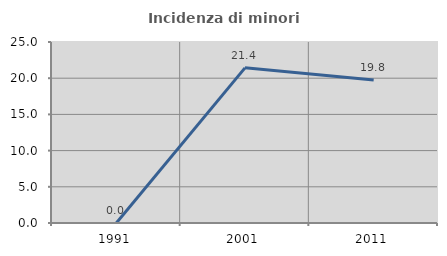
| Category | Incidenza di minori stranieri |
|---|---|
| 1991.0 | 0 |
| 2001.0 | 21.429 |
| 2011.0 | 19.753 |